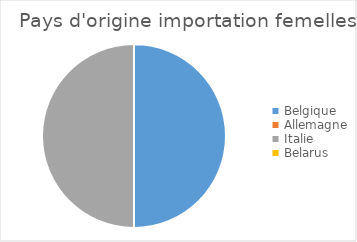
| Category | Series 0 |
|---|---|
| Belgique | 1 |
| Allemagne | 0 |
| Italie | 1 |
| Belarus | 0 |